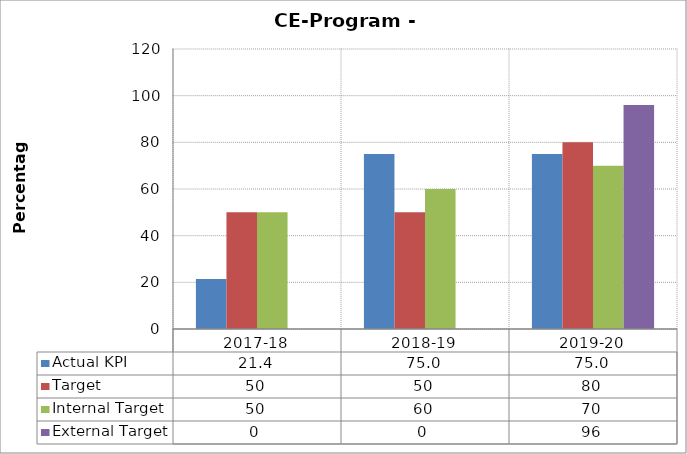
| Category | Actual KPI | Target  | Internal Target | External Target  |
|---|---|---|---|---|
| 2017-18 | 21.429 | 50 | 50 | 0 |
| 2018-19 | 75 | 50 | 60 | 0 |
| 2019-20 | 75 | 80 | 70 | 96 |